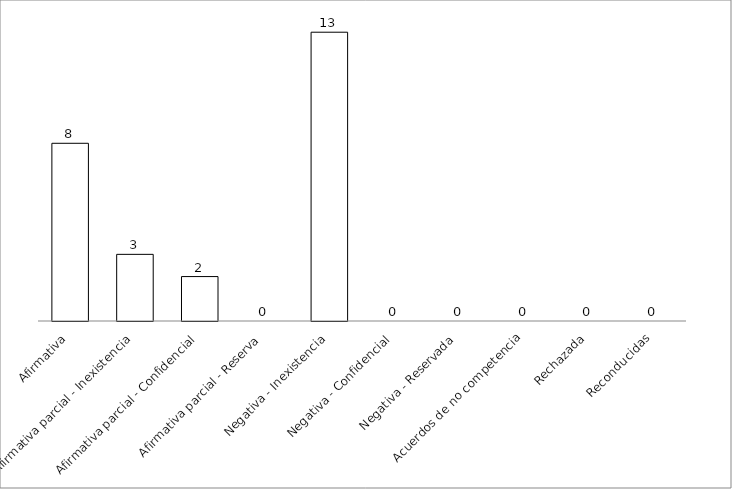
| Category | Series 0 |
|---|---|
| Afirmativa | 8 |
| Afirmativa parcial - Inexistencia | 3 |
| Afirmativa parcial - Confidencial | 2 |
| Afirmativa parcial - Reserva | 0 |
| Negativa - Inexistencia | 13 |
| Negativa - Confidencial | 0 |
| Negativa - Reservada | 0 |
| Acuerdos de no competencia | 0 |
| Rechazada | 0 |
| Reconducidas | 0 |